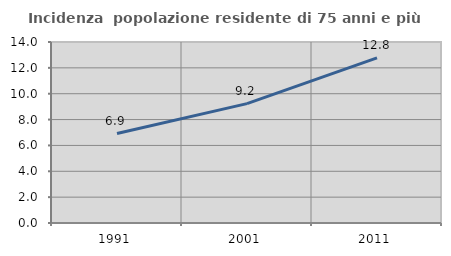
| Category | Incidenza  popolazione residente di 75 anni e più |
|---|---|
| 1991.0 | 6.919 |
| 2001.0 | 9.231 |
| 2011.0 | 12.77 |